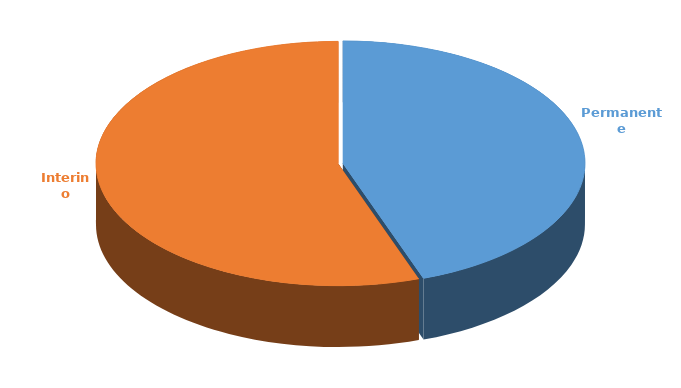
| Category | Cantidad |
|---|---|
| Permanente | 2746 |
| Interino | 3412 |